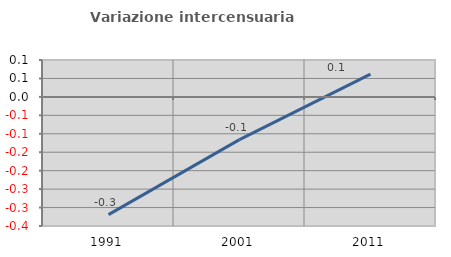
| Category | Variazione intercensuaria annua |
|---|---|
| 1991.0 | -0.319 |
| 2001.0 | -0.116 |
| 2011.0 | 0.062 |